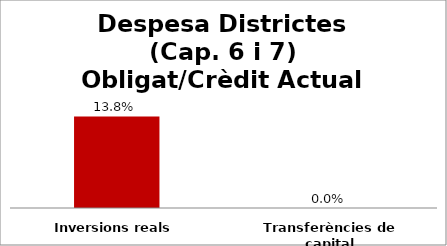
| Category | Series 0 |
|---|---|
| Inversions reals | 0.138 |
| Transferències de capital | 0 |